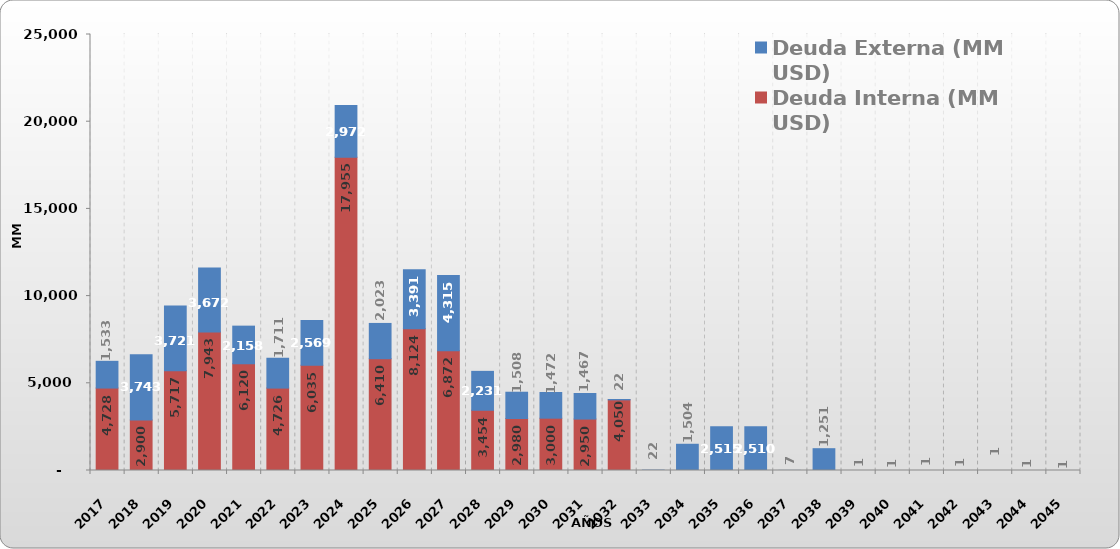
| Category | Deuda Interna (MM USD) | Deuda Externa (MM USD) |
|---|---|---|
| 2017.0 | 4727.548 | 1532.783 |
| 2018.0 | 2900.371 | 3742.606 |
| 2019.0 | 5716.796 | 3721.47 |
| 2020.0 | 7943.045 | 3672.181 |
| 2021.0 | 6119.69 | 2157.966 |
| 2022.0 | 4725.892 | 1710.879 |
| 2023.0 | 6034.526 | 2569.163 |
| 2024.0 | 17954.526 | 2971.872 |
| 2025.0 | 6410.189 | 2022.745 |
| 2026.0 | 8123.655 | 3390.591 |
| 2027.0 | 6872.248 | 4314.894 |
| 2028.0 | 3453.742 | 2231.135 |
| 2029.0 | 2980 | 1508.17 |
| 2030.0 | 3000 | 1471.686 |
| 2031.0 | 2950 | 1466.698 |
| 2032.0 | 4050 | 22.313 |
| 2033.0 | 0 | 22.043 |
| 2034.0 | 0 | 1504.201 |
| 2035.0 | 0 | 2515.201 |
| 2036.0 | 0 | 2510.132 |
| 2037.0 | 0 | 6.681 |
| 2038.0 | 0 | 1250.711 |
| 2039.0 | 0 | 0.708 |
| 2040.0 | 0 | 0.708 |
| 2041.0 | 0 | 0.708 |
| 2042.0 | 0 | 0.708 |
| 2043.0 | 0 | 0.708 |
| 2044.0 | 0 | 0.708 |
| 2045.0 | 0 | 0.708 |